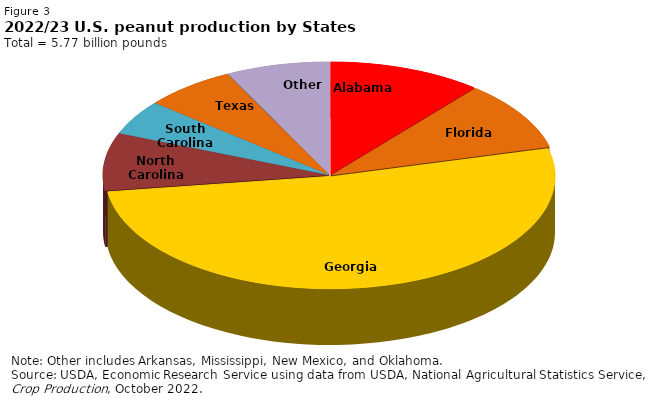
| Category | Series 0 |
|---|---|
| Alabama | 0.11 |
| Florida | 0.099 |
| Georgia | 0.518 |
| North Carolina | 0.082 |
| South Carolina | 0.049 |
| Texas | 0.065 |
| Other | 0.075 |